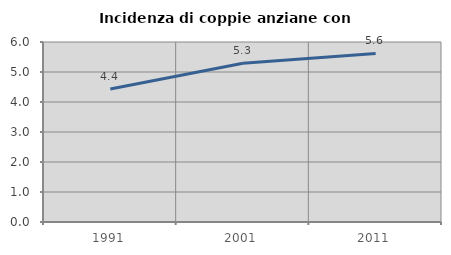
| Category | Incidenza di coppie anziane con figli |
|---|---|
| 1991.0 | 4.433 |
| 2001.0 | 5.291 |
| 2011.0 | 5.618 |